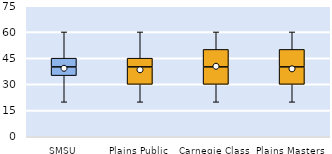
| Category | 25th | 50th | 75th |
|---|---|---|---|
| SMSU | 35 | 5 | 5 |
| Plains Public | 30 | 10 | 5 |
| Carnegie Class | 30 | 10 | 10 |
| Plains Masters | 30 | 10 | 10 |